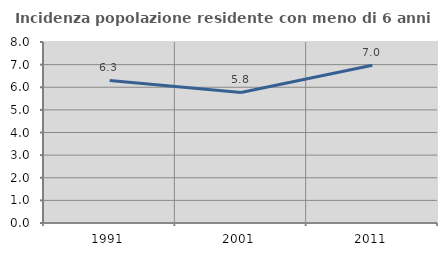
| Category | Incidenza popolazione residente con meno di 6 anni |
|---|---|
| 1991.0 | 6.303 |
| 2001.0 | 5.769 |
| 2011.0 | 6.973 |